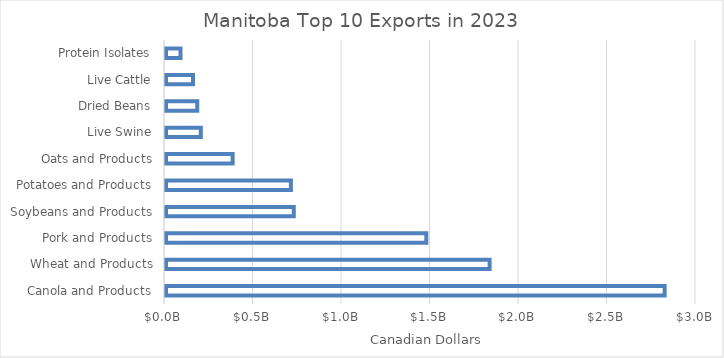
| Category | CAD Dollar |
|---|---|
| Canola and Products | 2822942934 |
| Wheat and Products | 1833984420 |
| Pork and Products | 1476366397 |
| Soybeans and Products | 727468945 |
| Potatoes and Products | 711237714 |
| Oats and Products | 382113382 |
| Live Swine | 202416928 |
| Dried Beans | 182707157 |
| Live Cattle | 158439454 |
| Protein Isolates | 87539966 |